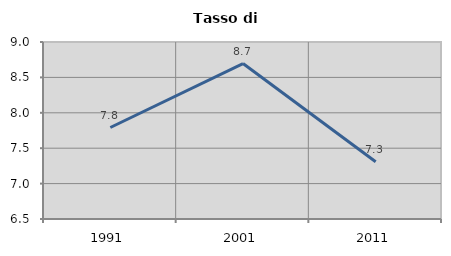
| Category | Tasso di disoccupazione   |
|---|---|
| 1991.0 | 7.792 |
| 2001.0 | 8.696 |
| 2011.0 | 7.309 |